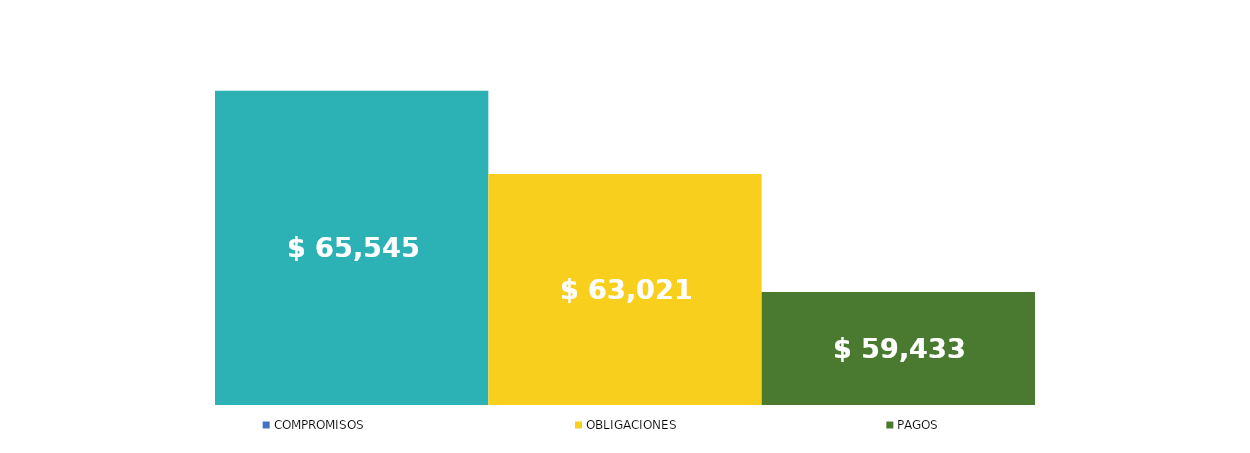
| Category | COMPROMISOS | OBLIGACIONES | PAGOS |
|---|---|---|---|
| Total | 65544991605.891 | 63021494244.396 | 59432515322.292 |